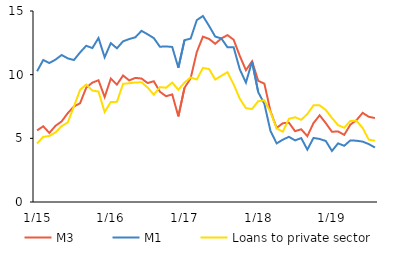
| Category | M3 | M1 | Loans to private sector |
|---|---|---|---|
|  1/15 | 5.622 | 10.265 | 4.593 |
| 2 | 5.948 | 11.151 | 5.114 |
| 3 | 5.423 | 10.914 | 5.186 |
| 4 | 5.983 | 11.181 | 5.467 |
| 5 | 6.33 | 11.545 | 5.955 |
| 6 | 6.98 | 11.278 | 6.253 |
| 7 | 7.5 | 11.149 | 7.503 |
| 8 | 7.755 | 11.745 | 8.802 |
| 9 | 8.971 | 12.27 | 9.227 |
| 10 | 9.377 | 12.089 | 8.753 |
| 11 | 9.559 | 12.878 | 8.672 |
| 12 | 8.244 | 11.367 | 7.06 |
|  1/16 | 9.691 | 12.477 | 7.853 |
| 2 | 9.221 | 12.071 | 7.865 |
| 3 | 9.937 | 12.619 | 9.286 |
| 4 | 9.548 | 12.796 | 9.325 |
| 5 | 9.747 | 12.937 | 9.385 |
| 6 | 9.696 | 13.442 | 9.403 |
| 7 | 9.341 | 13.169 | 8.992 |
| 8 | 9.484 | 12.872 | 8.426 |
| 9 | 8.659 | 12.193 | 9.022 |
| 10 | 8.307 | 12.218 | 8.975 |
| 11 | 8.449 | 12.177 | 9.38 |
| 12 | 6.723 | 10.54 | 8.816 |
|  1/17 | 8.966 | 12.711 | 9.379 |
| 2 | 9.714 | 12.834 | 9.781 |
| 3 | 11.775 | 14.282 | 9.62 |
| 4 | 12.987 | 14.606 | 10.528 |
| 5 | 12.808 | 13.83 | 10.445 |
| 6 | 12.425 | 12.993 | 9.619 |
| 7 | 12.849 | 12.842 | 9.914 |
| 8 | 13.105 | 12.147 | 10.193 |
| 9 | 12.743 | 12.148 | 9.238 |
| 10 | 11.473 | 10.419 | 8.113 |
| 11 | 10.355 | 9.377 | 7.368 |
| 12 | 11.047 | 11.032 | 7.305 |
|  1/18 | 9.516 | 8.626 | 7.918 |
| 2 | 9.298 | 7.714 | 7.983 |
| 3 | 7.121 | 5.573 | 7.051 |
| 4 | 5.819 | 4.602 | 5.78 |
| 5 | 6.185 | 4.894 | 5.522 |
| 6 | 6.228 | 5.118 | 6.536 |
| 7 | 5.561 | 4.84 | 6.657 |
| 8 | 5.712 | 5.02 | 6.454 |
| 9 | 5.172 | 4.113 | 6.908 |
| 10 | 6.2 | 5.031 | 7.59 |
| 11 | 6.807 | 4.95 | 7.588 |
| 12 | 6.195 | 4.794 | 7.229 |
|  1/19 | 5.516 | 4.009 | 6.6 |
| 2 | 5.54 | 4.604 | 6.035 |
| 3 | 5.275 | 4.413 | 5.835 |
| 4 | 6.075 | 4.839 | 6.369 |
| 5 | 6.427 | 4.813 | 6.374 |
| 6 | 7.002 | 4.742 | 5.815 |
| 7 | 6.692 | 4.549 | 4.899 |
| 8 | 6.593 | 4.28 | 4.81 |